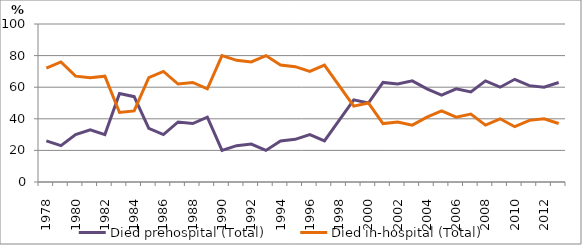
| Category | Died prehospital (Total) | Died in-hospital (Total) |
|---|---|---|
| 1978.0 | 26 | 72 |
| 1979.0 | 23 | 76 |
| 1980.0 | 30 | 67 |
| 1981.0 | 33 | 66 |
| 1982.0 | 30 | 67 |
| 1983.0 | 56 | 44 |
| 1984.0 | 54 | 45 |
| 1985.0 | 34 | 66 |
| 1986.0 | 30 | 70 |
| 1987.0 | 38 | 62 |
| 1988.0 | 37 | 63 |
| 1989.0 | 41 | 59 |
| 1990.0 | 20 | 80 |
| 1991.0 | 23 | 77 |
| 1992.0 | 24 | 76 |
| 1993.0 | 20 | 80 |
| 1994.0 | 26 | 74 |
| 1995.0 | 27 | 73 |
| 1996.0 | 30 | 70 |
| 1997.0 | 26 | 74 |
| 1998.0 | 39 | 61 |
| 1999.0 | 52 | 48 |
| 2000.0 | 50 | 50 |
| 2001.0 | 63 | 37 |
| 2002.0 | 62 | 38 |
| 2003.0 | 64 | 36 |
| 2004.0 | 59 | 41 |
| 2005.0 | 55 | 45 |
| 2006.0 | 59 | 41 |
| 2007.0 | 57 | 43 |
| 2008.0 | 64 | 36 |
| 2009.0 | 60 | 40 |
| 2010.0 | 65 | 35 |
| 2011.0 | 61 | 39 |
| 2012.0 | 60 | 40 |
| 2013.0 | 63 | 37 |